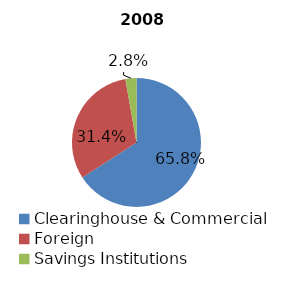
| Category | Series 0 |
|---|---|
| Clearinghouse & Commercial | 477517031 |
| Foreign | 227652279 |
| Savings Institutions | 20027061 |